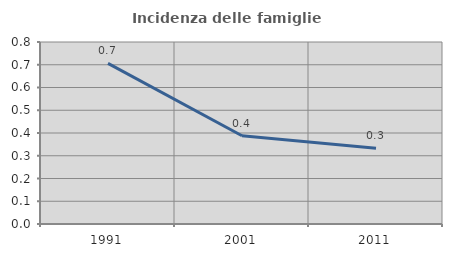
| Category | Incidenza delle famiglie numerose |
|---|---|
| 1991.0 | 0.706 |
| 2001.0 | 0.388 |
| 2011.0 | 0.333 |